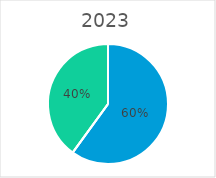
| Category | 2023 |
|---|---|
| Ouvriers | 0 |
| Employés | 192 |
| Maitrise | 0 |
| Ingénieurs et Cadres | 128 |
| Autres | 0 |